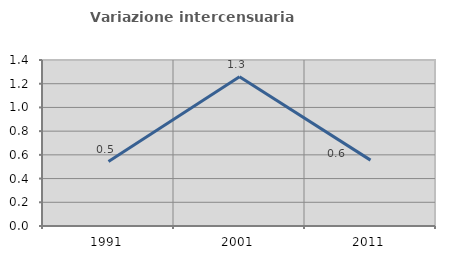
| Category | Variazione intercensuaria annua |
|---|---|
| 1991.0 | 0.544 |
| 2001.0 | 1.259 |
| 2011.0 | 0.555 |